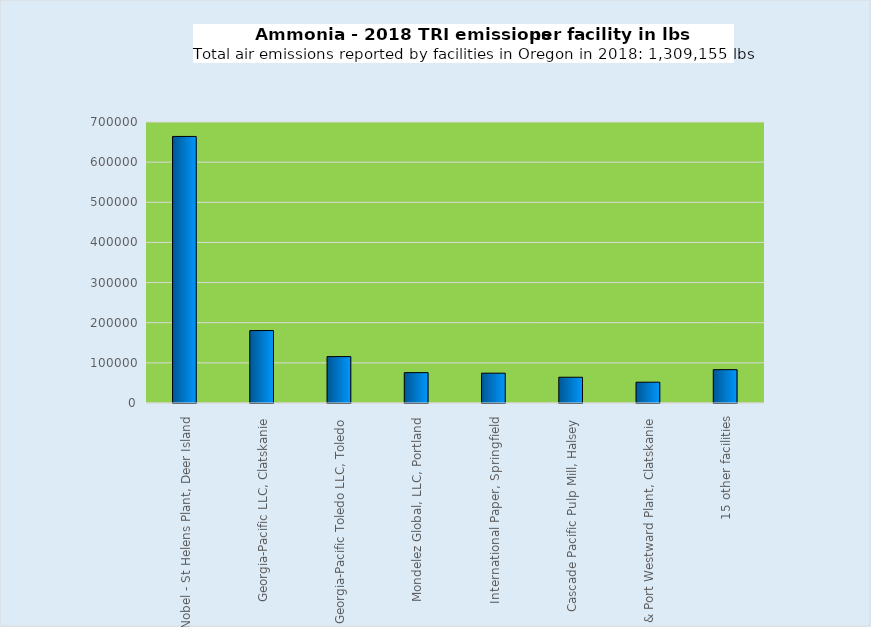
| Category | Series 0 |
|---|---|
| Dyno Nobel - St Helens Plant, Deer Island | 664000 |
| Georgia-Pacific LLC, Clatskanie | 180500 |
| Georgia-Pacific Toledo LLC, Toledo | 115606 |
| Mondelez Global, LLC, Portland | 75664 |
| International Paper, Springfield | 74300 |
| Cascade Pacific Pulp Mill, Halsey | 64171 |
| PGE Beaver Plant & Port Westward Plant, Clatskanie | 51829 |
| 15 other facilities | 83085 |